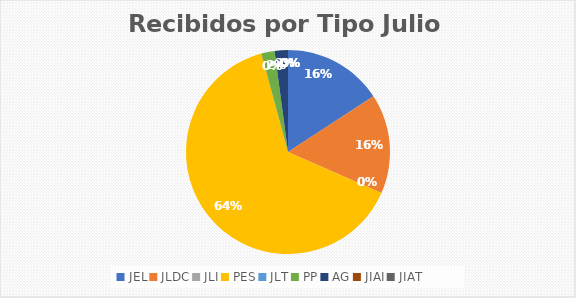
| Category | Series 0 |
|---|---|
| JEL | 15 |
| JLDC | 15 |
| JLI | 0 |
| PES | 61 |
| JLT | 0 |
| PP | 2 |
| AG | 2 |
| JIAI | 0 |
| JIAT | 0 |